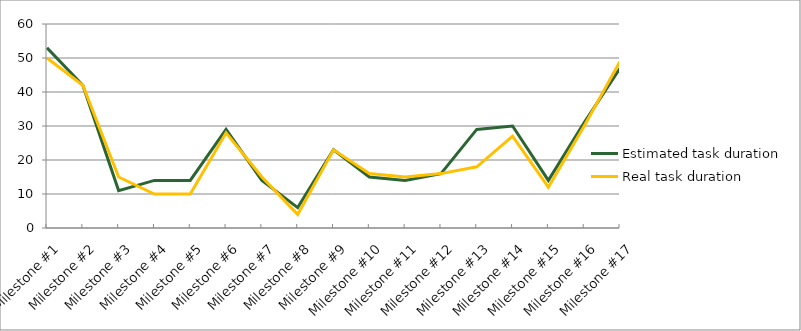
| Category | Estimated task duration | Real task duration |
|---|---|---|
| Milestone #1 | 53 | 50 |
| Milestone #2 | 42 | 42 |
| Milestone #3 | 11 | 15 |
| Milestone #4 | 14 | 10 |
| Milestone #5 | 14 | 10 |
| Milestone #6 | 29 | 28 |
| Milestone #7 | 14 | 15 |
| Milestone #8 | 6 | 4 |
| Milestone #9 | 23 | 23 |
| Milestone #10 | 15 | 16 |
| Milestone #11 | 14 | 15 |
| Milestone #12 | 16 | 16 |
| Milestone #13 | 29 | 18 |
| Milestone #14 | 30 | 27 |
| Milestone #15 | 14 | 12 |
| Milestone #16 | 31 | 30 |
| Milestone #17 | 47 | 49 |